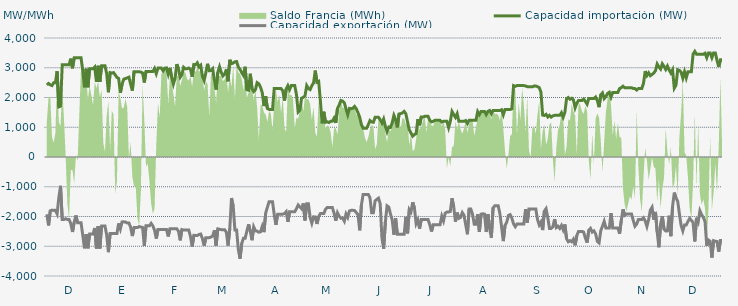
| Category | Capacidad importación (MW) | Capacidad exportación (MW) |
|---|---|---|
| 0 | 2425 | -1925 |
| 1900-01-01 | 2470.833 | -2300 |
| 1900-01-02 | 2425 | -1808.333 |
| 1900-01-03 | 2400 | -1785.417 |
| 1900-01-04 | 2495.833 | -1795.833 |
| 1900-01-05 | 2497.917 | -1789.583 |
| 1900-01-06 | 2882.917 | -1912.5 |
| 1900-01-07 | 1685.417 | -1368.75 |
| 1900-01-08 | 1712.5 | -968.75 |
| 1900-01-09 | 3104.167 | -2100 |
| 1900-01-10 | 3104.167 | -2100 |
| 1900-01-11 | 3104.167 | -2075 |
| 1900-01-12 | 3104.167 | -2100 |
| 1900-01-13 | 3104.167 | -2100 |
| 1900-01-14 | 3306.25 | -2237.5 |
| 1900-01-15 | 2981.25 | -2520.833 |
| 1900-01-16 | 3333.333 | -2189.583 |
| 1900-01-17 | 3333.333 | -1964.583 |
| 1900-01-18 | 3333.333 | -2212.5 |
| 1900-01-19 | 3333.333 | -2212.5 |
| 1900-01-20 | 3333.333 | -2212.5 |
| 1900-01-21 | 2904.167 | -2625 |
| 1900-01-22 | 2343.75 | -3068.75 |
| 1900-01-23 | 2966.667 | -2589.583 |
| 1900-01-24 | 2343.75 | -3068.75 |
| 1900-01-25 | 2966.667 | -2589.583 |
| 1900-01-26 | 2966.667 | -2589.583 |
| 1900-01-27 | 2966.667 | -2589.583 |
| 1900-01-28 | 3025 | -2385.417 |
| 1900-01-29 | 2525 | -3075 |
| 1900-01-30 | 3066.667 | -2320.833 |
| 1900-01-31 | 2525 | -3075 |
| 1900-02-01 | 3066.667 | -2320.833 |
| 1900-02-02 | 3066.667 | -2320.833 |
| 1900-02-03 | 3066.667 | -2320.833 |
| 1900-02-04 | 2800 | -2622.917 |
| 1900-02-05 | 2177.083 | -3197.917 |
| 1900-02-06 | 2837.5 | -2568.75 |
| 1900-02-07 | 2820.833 | -2568.75 |
| 1900-02-08 | 2837.5 | -2568.75 |
| 1900-02-09 | 2758.333 | -2568.75 |
| 1900-02-10 | 2675 | -2568.75 |
| 1900-02-11 | 2641.667 | -2233.333 |
| 1900-02-12 | 2156.25 | -2418.75 |
| 1900-02-13 | 2450 | -2181.25 |
| 1900-02-14 | 2616.667 | -2179.167 |
| 1900-02-15 | 2637.5 | -2187.5 |
| 1900-02-16 | 2658.333 | -2216.667 |
| 1900-02-17 | 2683.333 | -2216.667 |
| 1900-02-18 | 2450 | -2362.5 |
| 1900-02-19 | 2231.25 | -2658.333 |
| 1900-02-20 | 2866.667 | -2372.917 |
| 1900-02-21 | 2866.667 | -2372.917 |
| 1900-02-22 | 2866.667 | -2372.917 |
| 1900-02-23 | 2866.667 | -2339.583 |
| 1900-02-24 | 2854.167 | -2352.083 |
| 1900-02-25 | 2825 | -2368.75 |
| 1900-02-26 | 2504.167 | -2991.667 |
| 1900-02-27 | 2875 | -2314.583 |
| 1900-02-28 | 2875 | -2314.583 |
| 1900-02-28 | 2875 | -2314.583 |
| 1900-03-01 | 2875 | -2231.25 |
| 1900-03-02 | 2875 | -2314.583 |
| 1900-03-03 | 2975 | -2462.5 |
| 1900-03-04 | 2802.083 | -2741.667 |
| 1900-03-05 | 2987.5 | -2433.333 |
| 1900-03-06 | 2987.5 | -2433.333 |
| 1900-03-07 | 2987.5 | -2433.333 |
| 1900-03-08 | 2893.75 | -2433.333 |
| 1900-03-09 | 2987.5 | -2433.333 |
| 1900-03-10 | 2995.833 | -2437.5 |
| 1900-03-11 | 2781.25 | -2670.833 |
| 1900-03-12 | 2993.75 | -2412.5 |
| 1900-03-13 | 2679.167 | -2412.5 |
| 1900-03-14 | 2450 | -2412.5 |
| 1900-03-15 | 2645.833 | -2412.5 |
| 1900-03-16 | 3120.833 | -2412.5 |
| 1900-03-17 | 2958.333 | -2495.833 |
| 1900-03-18 | 2681.25 | -2802.083 |
| 1900-03-19 | 2768.75 | -2439.583 |
| 1900-03-20 | 3016.667 | -2456.25 |
| 1900-03-21 | 2966.667 | -2454.167 |
| 1900-03-22 | 2966.667 | -2452.083 |
| 1900-03-23 | 2991.667 | -2454.167 |
| 1900-03-24 | 2952.083 | -2670.833 |
| 1900-03-25 | 2697.917 | -3016.667 |
| 1900-03-26 | 3108.333 | -2631.25 |
| 1900-03-27 | 3100 | -2637.5 |
| 1900-03-28 | 3166.667 | -2637.5 |
| 1900-03-29 | 3025 | -2604.167 |
| 1900-03-30 | 3083.333 | -2589.583 |
| 1900-03-31 | 2708.333 | -2743.75 |
| 1900-04-01 | 2570.833 | -2979.167 |
| 1900-04-02 | 2833.333 | -2716.667 |
| 1900-04-03 | 3133.333 | -2716.667 |
| 1900-04-04 | 2900 | -2710.417 |
| 1900-04-05 | 2904.167 | -2689.583 |
| 1900-04-06 | 2966.667 | -2654.167 |
| 1900-04-07 | 2587.5 | -2462.5 |
| 1900-04-08 | 2266.667 | -2977.083 |
| 1900-04-09 | 2845.833 | -2416.667 |
| 1900-04-10 | 3033.333 | -2429.167 |
| 1900-04-11 | 2845.833 | -2441.667 |
| 1900-04-12 | 2725 | -2441.667 |
| 1900-04-13 | 2783.333 | -2441.667 |
| 1900-04-14 | 2943.75 | -2529.167 |
| 1900-04-15 | 2545.833 | -2975 |
| 1900-04-16 | 3266.667 | -2410.417 |
| 1900-04-17 | 3137.5 | -1379.167 |
| 1900-04-18 | 3158.333 | -1654.167 |
| 1900-04-19 | 3200 | -2454.167 |
| 1900-04-20 | 3208.333 | -2456.25 |
| 1900-04-21 | 3025 | -3112.5 |
| 1900-04-22 | 2943.75 | -3418.75 |
| 1900-04-23 | 2835.417 | -2900 |
| 1900-04-24 | 2741.667 | -2729.167 |
| 1900-04-25 | 3033.333 | -2729.167 |
| 1900-04-26 | 2262.5 | -2487.5 |
| 1900-04-27 | 2245.833 | -2262.5 |
| 1900-04-28 | 2797.917 | -2500 |
| 1900-04-29 | 2295.652 | -2797.826 |
| 1900-04-30 | 2200 | -2350 |
| 1900-05-01 | 2262.5 | -2481.25 |
| 1900-05-02 | 2500 | -2491.667 |
| 1900-05-03 | 2458.333 | -2529.167 |
| 1900-05-04 | 2341.667 | -2512.5 |
| 1900-05-05 | 2162.5 | -2331.25 |
| 1900-05-06 | 1712.5 | -2525 |
| 1900-05-07 | 2043.75 | -1885.417 |
| 1900-05-08 | 1629.167 | -1687.5 |
| 1900-05-09 | 1600 | -1500 |
| 1900-05-10 | 1600 | -1500 |
| 1900-05-11 | 1600 | -1500 |
| 1900-05-12 | 2300 | -1937.5 |
| 1900-05-13 | 2300 | -2281.25 |
| 1900-05-14 | 2300 | -1920.833 |
| 1900-05-15 | 2300 | -1920.833 |
| 1900-05-16 | 2300 | -1920.833 |
| 1900-05-17 | 2225 | -1920.833 |
| 1900-05-18 | 1896.083 | -1898.167 |
| 1900-05-19 | 2287.5 | -1837.5 |
| 1900-05-20 | 2400 | -2181.25 |
| 1900-05-21 | 2266.667 | -1837.5 |
| 1900-05-22 | 2400 | -1841.667 |
| 1900-05-23 | 2400 | -1841.667 |
| 1900-05-24 | 2400 | -1841.667 |
| 1900-05-25 | 2100 | -1737.5 |
| 1900-05-26 | 1512.5 | -1612.5 |
| 1900-05-27 | 1575 | -1675 |
| 1900-05-28 | 1975 | -1737.5 |
| 1900-05-29 | 2008.333 | -1560.417 |
| 1900-05-30 | 2056.25 | -2133.333 |
| 1900-05-31 | 2400 | -1570.833 |
| 1900-06-01 | 2300 | -1570.833 |
| 1900-06-02 | 2266.667 | -2031.25 |
| 1900-06-03 | 2400 | -2225 |
| 1900-06-04 | 2487.5 | -2010.417 |
| 1900-06-05 | 2904.167 | -2016.667 |
| 1900-06-06 | 2512.5 | -2250 |
| 1900-06-07 | 2541.667 | -2000 |
| 1900-06-08 | 1884.392 | -1900 |
| 1900-06-09 | 1133.333 | -1900 |
| 1900-06-10 | 1520.875 | -1900 |
| 1900-06-11 | 1166.667 | -1758.333 |
| 1900-06-12 | 1183.333 | -1700 |
| 1900-06-13 | 1158.333 | -1700 |
| 1900-06-14 | 1200 | -1700 |
| 1900-06-15 | 1200 | -1700 |
| 1900-06-16 | 1304.583 | -1887.5 |
| 1900-06-17 | 1145.417 | -2139.583 |
| 1900-06-18 | 1629.167 | -1875 |
| 1900-06-19 | 1750 | -1987.5 |
| 1900-06-20 | 1900 | -2058.333 |
| 1900-06-21 | 1879.167 | -2050 |
| 1900-06-22 | 1820.833 | -2156.25 |
| 1900-06-23 | 1616.667 | -1912.5 |
| 1900-06-24 | 1420.833 | -2027.083 |
| 1900-06-25 | 1633.333 | -1812.5 |
| 1900-06-26 | 1625 | -1791.667 |
| 1900-06-27 | 1637.5 | -1791.667 |
| 1900-06-28 | 1700 | -1800 |
| 1900-06-29 | 1620.833 | -1868.75 |
| 1900-06-30 | 1487.5 | -1937.5 |
| 1900-07-01 | 1337.5 | -2464.583 |
| 1900-07-02 | 1083.333 | -1610.417 |
| 1900-07-03 | 966.667 | -1258.333 |
| 1900-07-04 | 966.667 | -1258.333 |
| 1900-07-05 | 966.667 | -1258.333 |
| 1900-07-06 | 1083.333 | -1258.333 |
| 1900-07-07 | 1225 | -1375 |
| 1900-07-08 | 1175 | -1875 |
| 1900-07-09 | 1166.667 | -1875 |
| 1900-07-10 | 1333.333 | -1475 |
| 1900-07-11 | 1333.333 | -1425 |
| 1900-07-12 | 1333.333 | -1383.333 |
| 1900-07-13 | 1254.167 | -1577.083 |
| 1900-07-14 | 1133.333 | -2725 |
| 1900-07-15 | 1275 | -3081.25 |
| 1900-07-16 | 1029.167 | -2189.583 |
| 1900-07-17 | 850 | -1641.667 |
| 1900-07-18 | 1008.333 | -1683.333 |
| 1900-07-19 | 991.667 | -1916.667 |
| 1900-07-20 | 1150 | -2114.583 |
| 1900-07-21 | 1400 | -2612.5 |
| 1900-07-22 | 1262.5 | -2058.333 |
| 1900-07-23 | 995.833 | -2600 |
| 1900-07-24 | 1445.833 | -2600 |
| 1900-07-25 | 1458.333 | -2600 |
| 1900-07-26 | 1483.333 | -2600 |
| 1900-07-27 | 1533.333 | -2600 |
| 1900-07-28 | 1450 | -2012.5 |
| 1900-07-29 | 1175 | -2566.667 |
| 1900-07-30 | 912.5 | -1762.5 |
| 1900-07-31 | 806.25 | -1841.667 |
| 1900-08-01 | 700 | -1520.833 |
| 1900-08-02 | 756.25 | -1710.417 |
| 1900-08-03 | 783.333 | -2239.583 |
| 1900-08-04 | 1270.833 | -2112.5 |
| 1900-08-05 | 1066.667 | -2410.417 |
| 1900-08-06 | 1345.833 | -2104.167 |
| 1900-08-07 | 1341.667 | -2104.167 |
| 1900-08-08 | 1366.667 | -2104.167 |
| 1900-08-09 | 1366.667 | -2104.167 |
| 1900-08-10 | 1366.667 | -2104.167 |
| 1900-08-11 | 1231.25 | -2275 |
| 1900-08-12 | 1181.25 | -2504.167 |
| 1900-08-13 | 1200 | -2275 |
| 1900-08-14 | 1233.333 | -2275 |
| 1900-08-15 | 1233.333 | -2275 |
| 1900-08-16 | 1233.333 | -2275 |
| 1900-08-17 | 1233.333 | -2275 |
| 1900-08-18 | 1175 | -1987.5 |
| 1900-08-19 | 1200 | -2147.917 |
| 1900-08-20 | 1200 | -1887.5 |
| 1900-08-21 | 1200 | -1850 |
| 1900-08-22 | 987.5 | -1850 |
| 1900-08-23 | 1200 | -1831.25 |
| 1900-08-24 | 1529.167 | -1387.5 |
| 1900-08-25 | 1427.083 | -1679.167 |
| 1900-08-26 | 1331.25 | -2172.917 |
| 1900-08-27 | 1456.25 | -1868.75 |
| 1900-08-28 | 1200 | -2060.417 |
| 1900-08-29 | 1200 | -2029.167 |
| 1900-08-30 | 1200 | -1868.75 |
| 1900-08-31 | 1200 | -1958.333 |
| 1900-09-01 | 1225 | -2275 |
| 1900-09-02 | 1125 | -2595.833 |
| 1900-09-03 | 1233.333 | -1750 |
| 1900-09-04 | 1233.333 | -1750 |
| 1900-09-05 | 1233.333 | -1925 |
| 1900-09-06 | 1233.333 | -2262.5 |
| 1900-09-07 | 1233.333 | -2262.5 |
| 1900-09-08 | 1525 | -1925 |
| 1900-09-09 | 1425 | -2520.833 |
| 1900-09-10 | 1533.333 | -1920.833 |
| 1900-09-11 | 1533.333 | -1908.333 |
| 1900-09-12 | 1533.333 | -1920.833 |
| 1900-09-13 | 1425 | -2520.833 |
| 1900-09-14 | 1533.333 | -1920.833 |
| 1900-09-15 | 1562.5 | -2412.5 |
| 1900-09-16 | 1454.167 | -2710.417 |
| 1900-09-17 | 1566.667 | -1712.5 |
| 1900-09-18 | 1566.667 | -1641.667 |
| 1900-09-19 | 1566.667 | -1641.667 |
| 1900-09-20 | 1566.667 | -1641.667 |
| 1900-09-21 | 1566.667 | -1904.167 |
| 1900-09-22 | 1587.5 | -2362.5 |
| 1900-09-23 | 1418.75 | -2827.083 |
| 1900-09-24 | 1595.833 | -2297.917 |
| 1900-09-25 | 1595.833 | -2193.75 |
| 1900-09-26 | 1595.833 | -1964.583 |
| 1900-09-27 | 1595.833 | -1937.5 |
| 1900-09-28 | 1618.75 | -2058.333 |
| 1900-09-29 | 2400 | -2250 |
| 1900-09-30 | 2375 | -2341.667 |
| 1900-10-01 | 2400 | -2250 |
| 1900-10-02 | 2400 | -2250 |
| 1900-10-03 | 2400 | -2250 |
| 1900-10-04 | 2400 | -2250 |
| 1900-10-05 | 2400 | -2250 |
| 1900-10-06 | 2387.5 | -1750 |
| 1900-10-07 | 2364.583 | -2208.333 |
| 1900-10-08 | 2364.583 | -1745.833 |
| 1900-10-09 | 2360.417 | -1745.833 |
| 1900-10-10 | 2358.333 | -1745.833 |
| 1900-10-11 | 2387.5 | -1745.833 |
| 1900-10-12 | 2387.5 | -1745.833 |
| 1900-10-13 | 2362.5 | -2100 |
| 1900-10-14 | 2335.417 | -2283.333 |
| 1900-10-15 | 2181.25 | -2187.5 |
| 1900-10-16 | 1408.333 | -2456.25 |
| 1900-10-17 | 1395.833 | -1820.833 |
| 1900-10-18 | 1433.333 | -1737.5 |
| 1900-10-19 | 1345.833 | -2037.5 |
| 1900-10-20 | 1400 | -2400 |
| 1900-10-21 | 1341.667 | -2400 |
| 1900-10-22 | 1383.333 | -2345.833 |
| 1900-10-23 | 1400 | -2087.5 |
| 1900-10-24 | 1400 | -2370.833 |
| 1900-10-25 | 1400 | -2327.083 |
| 1900-10-26 | 1400 | -2400 |
| 1900-10-27 | 1487.5 | -2300 |
| 1900-10-28 | 1337.5 | -2445.833 |
| 1900-10-29 | 1500 | -2266.667 |
| 1900-10-30 | 1958.333 | -2750 |
| 1900-10-31 | 2000 | -2850 |
| 1900-11-01 | 1941.667 | -2812.5 |
| 1900-11-02 | 1975 | -2850 |
| 1900-11-03 | 1920.833 | -2762.5 |
| 1900-11-04 | 1654.167 | -2968.75 |
| 1900-11-05 | 1808.333 | -2639.583 |
| 1900-11-06 | 1900 | -2500 |
| 1900-11-07 | 1900 | -2500 |
| 1900-11-08 | 1900 | -2500 |
| 1900-11-09 | 1950 | -2525 |
| 1900-11-10 | 1866.667 | -2727.083 |
| 1900-11-11 | 1775 | -2877.083 |
| 1900-11-12 | 1966.667 | -2462.5 |
| 1900-11-13 | 1966.667 | -2400 |
| 1900-11-14 | 1966.667 | -2525 |
| 1900-11-15 | 1966.667 | -2483.333 |
| 1900-11-16 | 2016.667 | -2583.333 |
| 1900-11-17 | 1900 | -2837.5 |
| 1900-11-18 | 1675 | -2887.5 |
| 1900-11-19 | 2091.667 | -2477.083 |
| 1900-11-20 | 2154.167 | -2325 |
| 1900-11-21 | 1962.5 | -2162.5 |
| 1900-11-22 | 2029.167 | -2387.5 |
| 1900-11-23 | 2137.5 | -2387.5 |
| 1900-11-24 | 2175 | -2387.5 |
| 1900-11-25 | 2010 | -1886 |
| 1900-11-26 | 2170.833 | -2383.333 |
| 1900-11-27 | 2170.833 | -2383.333 |
| 1900-11-28 | 2170.833 | -2383.333 |
| 1900-11-29 | 2170.833 | -2383.333 |
| 1900-11-30 | 2300 | -2579.167 |
| 1900-12-01 | 2331.25 | -2131.25 |
| 1900-12-02 | 2379.167 | -1758.333 |
| 1900-12-03 | 2329.167 | -1960.417 |
| 1900-12-04 | 2329.167 | -1916.667 |
| 1900-12-05 | 2329.167 | -1916.667 |
| 1900-12-06 | 2329.167 | -1916.667 |
| 1900-12-07 | 2329.167 | -1918.75 |
| 1900-12-08 | 2300 | -2131.25 |
| 1900-12-09 | 2300 | -2325 |
| 1900-12-10 | 2250 | -2256.25 |
| 1900-12-11 | 2300 | -2104.167 |
| 1900-12-12 | 2300 | -2104.167 |
| 1900-12-13 | 2300 | -2104.167 |
| 1900-12-14 | 2475 | -2043.75 |
| 1900-12-15 | 2887.5 | -2150 |
| 1900-12-16 | 2737.5 | -2335.417 |
| 1900-12-17 | 2829.167 | -2106.25 |
| 1900-12-18 | 2732.25 | -1787 |
| 1900-12-19 | 2775 | -1691.667 |
| 1900-12-20 | 2820.833 | -2106.25 |
| 1900-12-21 | 2900 | -1845.833 |
| 1900-12-22 | 3125 | -2520.833 |
| 1900-12-23 | 3025 | -3033.333 |
| 1900-12-24 | 2956.25 | -2250 |
| 1900-12-25 | 3133.333 | -1987.5 |
| 1900-12-26 | 3045.833 | -2425 |
| 1900-12-27 | 2941.667 | -2485.417 |
| 1900-12-28 | 3058.333 | -2483.333 |
| 1900-12-29 | 2925 | -1975 |
| 1900-12-30 | 2825 | -2662.5 |
| 1900-12-31 | 2933.333 | -1658.333 |
| 1901-01-01 | 2312.5 | -1195.833 |
| 1901-01-02 | 2412.5 | -1375 |
| 1901-01-03 | 2933.333 | -1483.333 |
| 1901-01-04 | 2910.417 | -1912.5 |
| 1901-01-05 | 2850 | -2300 |
| 1901-01-06 | 2650 | -2483.333 |
| 1901-01-07 | 2866.667 | -2283.333 |
| 1901-01-08 | 2658.333 | -2283.333 |
| 1901-01-09 | 2866.667 | -2162.5 |
| 1901-01-10 | 2866.667 | -2066.667 |
| 1901-01-11 | 2866.667 | -2129.167 |
| 1901-01-12 | 3456.25 | -2204.167 |
| 1901-01-13 | 3550 | -2837.5 |
| 1901-01-14 | 3454.167 | -2041.667 |
| 1901-01-15 | 3454.167 | -2179.167 |
| 1901-01-16 | 3454.167 | -1808.333 |
| 1901-01-17 | 3454.167 | -1938.75 |
| 1901-01-18 | 3454.167 | -2029.167 |
| 1901-01-19 | 3487.5 | -2175 |
| 1901-01-20 | 3337.5 | -2983.333 |
| 1901-01-21 | 3500 | -2791.667 |
| 1901-01-22 | 3500 | -2833.333 |
| 1901-01-23 | 3337.5 | -3379.167 |
| 1901-01-24 | 3500 | -2812.5 |
| 1901-01-25 | 3500 | -2833.333 |
| 1901-01-26 | 3250 | -2837.5 |
| 1901-01-27 | 3028.25 | -3181.25 |
| 1901-01-28 | 3266.667 | -2808.333 |
| 1901-01-29 | 3266.667 | -2808.333 |